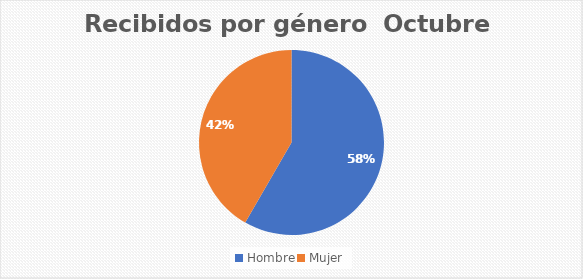
| Category | Recibidos por género  Cantidad |
|---|---|
| Hombre | 7 |
| Mujer | 5 |